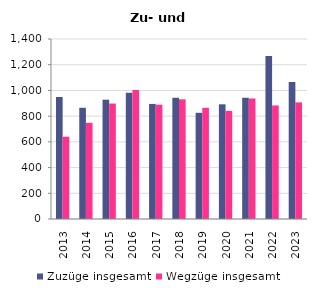
| Category | Zuzüge insgesamt | Wegzüge insgesamt |
|---|---|---|
| 2013.0 | 949 | 640 |
| 2014.0 | 865 | 748 |
| 2015.0 | 928 | 898 |
| 2016.0 | 982 | 1003 |
| 2017.0 | 895 | 889 |
| 2018.0 | 943 | 931 |
| 2019.0 | 826 | 865 |
| 2020.0 | 892 | 841 |
| 2021.0 | 943 | 937 |
| 2022.0 | 1267 | 883 |
| 2023.0 | 1066 | 907 |